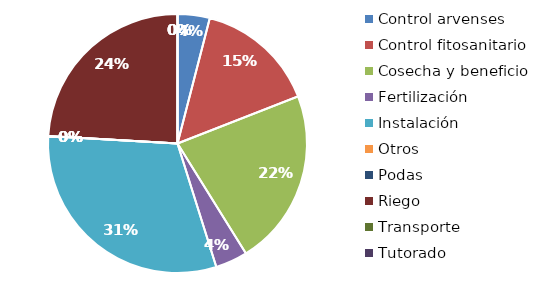
| Category | Valor |
|---|---|
| Control arvenses | 120000 |
| Control fitosanitario | 450000 |
| Cosecha y beneficio | 660000 |
| Fertilización | 120000 |
| Instalación | 920000 |
| Otros | 0 |
| Podas | 0 |
| Riego | 720000 |
| Transporte | 0 |
| Tutorado | 0 |